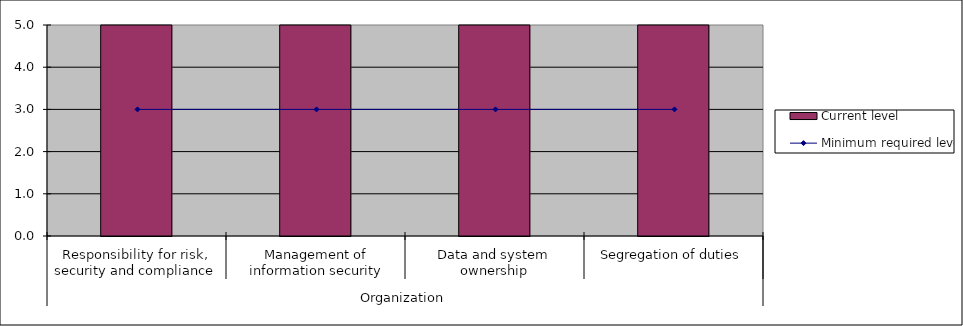
| Category | Current level |
|---|---|
| 0 | 5 |
| 1 | 5 |
| 2 | 5 |
| 3 | 5 |